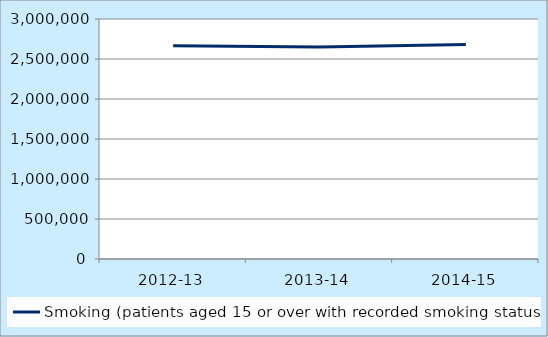
| Category | Smoking (patients aged 15 or over with recorded smoking status) |
|---|---|
| 2012-13 | 2666159 |
| 2013-14 | 2649437 |
| 2014-15 | 2680362 |